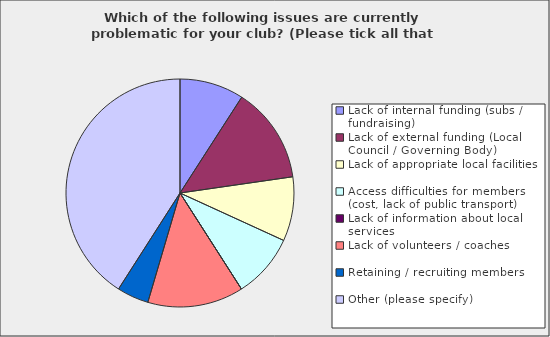
| Category | Series 0 |
|---|---|
| Lack of internal funding (subs / fundraising) | 0.091 |
| Lack of external funding (Local Council / Governing Body) | 0.136 |
| Lack of appropriate local facilities | 0.091 |
| Access difficulties for members (cost, lack of public transport) | 0.091 |
| Lack of information about local services | 0 |
| Lack of volunteers / coaches | 0.136 |
| Retaining / recruiting members | 0.045 |
| Other (please specify) | 0.409 |